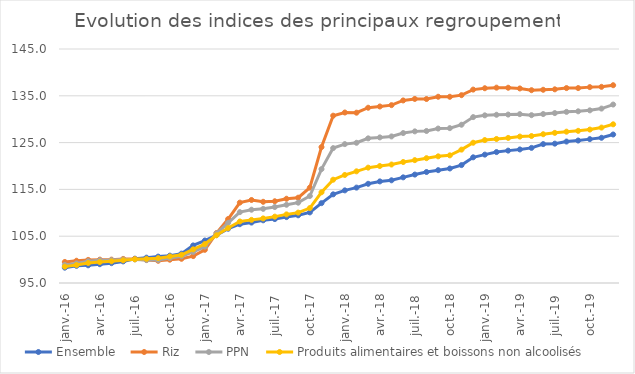
| Category |  Ensemble  |  Riz  |  PPN  |  Produits alimentaires et boissons non alcoolisés  |
|---|---|---|---|---|
| 2016-01-01 | 98.275 | 99.495 | 98.861 | 98.497 |
| 2016-02-01 | 98.669 | 99.754 | 99.183 | 98.836 |
| 2016-03-01 | 98.78 | 99.934 | 99.647 | 99.278 |
| 2016-04-01 | 99.017 | 99.994 | 99.867 | 99.476 |
| 2016-05-01 | 99.242 | 99.991 | 99.897 | 99.634 |
| 2016-06-01 | 99.614 | 100.144 | 100.021 | 99.851 |
| 2016-07-01 | 100.2 | 100.14 | 100.04 | 100.066 |
| 2016-08-01 | 100.412 | 99.904 | 99.904 | 100.159 |
| 2016-09-01 | 100.639 | 99.746 | 99.918 | 100.312 |
| 2016-10-01 | 100.848 | 99.979 | 100.318 | 100.675 |
| 2016-11-01 | 101.278 | 100.17 | 100.701 | 101.025 |
| 2016-12-01 | 103.026 | 100.747 | 101.643 | 102.191 |
| 2017-01-01 | 104.075 | 102.088 | 102.766 | 103.319 |
| 2017-02-01 | 105.227 | 105.671 | 105.604 | 105.201 |
| 2017-03-01 | 106.597 | 108.676 | 107.857 | 106.739 |
| 2017-04-01 | 107.562 | 112.176 | 110.14 | 108.143 |
| 2017-05-01 | 107.914 | 112.738 | 110.659 | 108.491 |
| 2017-06-01 | 108.397 | 112.351 | 110.843 | 108.798 |
| 2017-07-01 | 108.659 | 112.464 | 111.234 | 109.178 |
| 2017-08-01 | 109.085 | 113.002 | 111.719 | 109.659 |
| 2017-09-01 | 109.466 | 113.231 | 112.163 | 110.039 |
| 2017-10-01 | 110.085 | 115.374 | 113.583 | 111.008 |
| 2017-11-01 | 112.067 | 124.042 | 119.334 | 114.381 |
| 2017-12-01 | 113.945 | 130.752 | 123.824 | 117.072 |
| 2018-01-01 | 114.792 | 131.429 | 124.677 | 118.083 |
| 2018-02-01 | 115.382 | 131.39 | 124.962 | 118.86 |
| 2018-03-01 | 116.197 | 132.45 | 125.908 | 119.648 |
| 2018-04-01 | 116.708 | 132.716 | 126.112 | 119.992 |
| 2018-05-01 | 116.945 | 133.005 | 126.317 | 120.318 |
| 2018-06-01 | 117.574 | 134.006 | 127.039 | 120.852 |
| 2018-07-01 | 118.169 | 134.333 | 127.399 | 121.251 |
| 2018-08-01 | 118.716 | 134.315 | 127.482 | 121.67 |
| 2018-09-01 | 119.112 | 134.797 | 128.002 | 122.064 |
| 2018-10-01 | 119.471 | 134.79 | 128.09 | 122.277 |
| 2018-11-01 | 120.196 | 135.136 | 128.817 | 123.5 |
| 2018-12-01 | 121.856 | 136.326 | 130.448 | 124.972 |
| 2019-01-01 | 122.431 | 136.617 | 130.824 | 125.539 |
| 2019-02-01 | 122.976 | 136.743 | 130.947 | 125.775 |
| 2019-03-01 | 123.287 | 136.724 | 130.988 | 126.003 |
| 2019-04-01 | 123.539 | 136.57 | 131.08 | 126.288 |
| 2019-05-01 | 123.87 | 136.199 | 130.864 | 126.405 |
| 2019-06-01 | 124.678 | 136.285 | 131.1 | 126.791 |
| 2019-07-01 | 124.773 | 136.384 | 131.306 | 127.081 |
| 2019-08-01 | 125.224 | 136.653 | 131.568 | 127.335 |
| 2019-09-01 | 125.442 | 136.653 | 131.684 | 127.515 |
| 2019-10-01 | 125.743 | 136.854 | 131.892 | 127.783 |
| 2019-11-01 | 126.03 | 136.915 | 132.269 | 128.209 |
| 2019-12-01 | 126.732 | 137.262 | 133.132 | 128.908 |